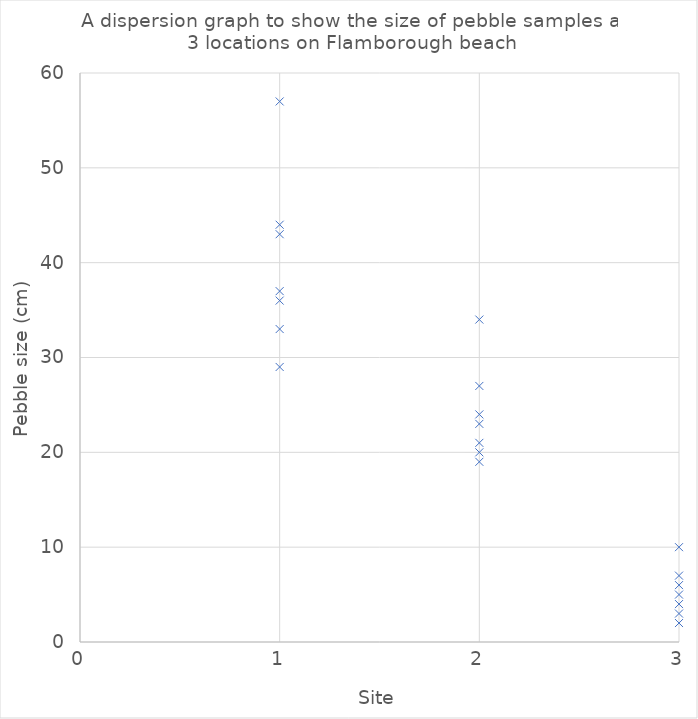
| Category | Series 0 |
|---|---|
| 1.0 | 37 |
| 1.0 | 33 |
| 1.0 | 44 |
| 1.0 | 57 |
| 1.0 | 43 |
| 1.0 | 29 |
| 1.0 | 36 |
| 2.0 | 20 |
| 2.0 | 19 |
| 2.0 | 34 |
| 2.0 | 23 |
| 2.0 | 27 |
| 2.0 | 24 |
| 2.0 | 21 |
| 3.0 | 2 |
| 3.0 | 7 |
| 3.0 | 5 |
| 3.0 | 6 |
| 3.0 | 10 |
| 3.0 | 3 |
| 3.0 | 4 |